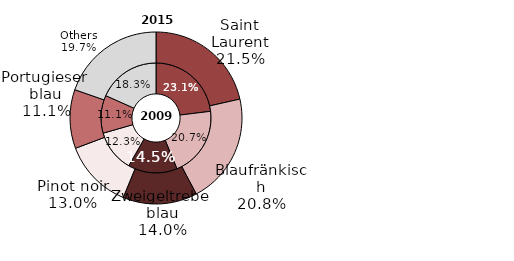
| Category | 2009 | 2015 |
|---|---|---|
| Saint Laurent | 1291.172 | 1184.447 |
| Blaufränkisch | 1159.676 | 1146.464 |
| Zweigeltrebe 
blau | 810.589 | 771.171 |
| Pinot noir | 688.473 | 719.577 |
| Portugieser 
blau | 622.437 | 610.251 |
| Others | 1026.314 | 1084.629 |